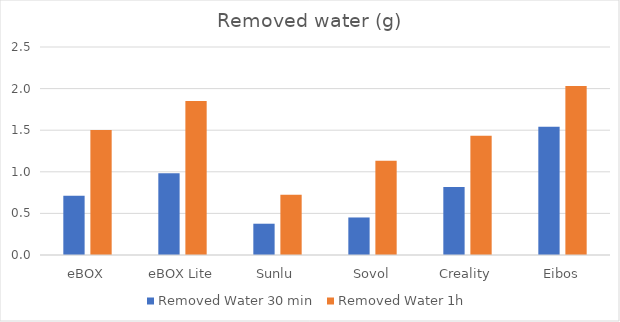
| Category | Removed Water 30 min | Removed Water 1h |
|---|---|---|
| eBOX | 0.712 | 1.502 |
| eBOX Lite | 0.983 | 1.851 |
| Sunlu | 0.376 | 0.725 |
| Sovol | 0.451 | 1.134 |
| Creality | 0.818 | 1.433 |
| Eibos | 1.541 | 2.031 |